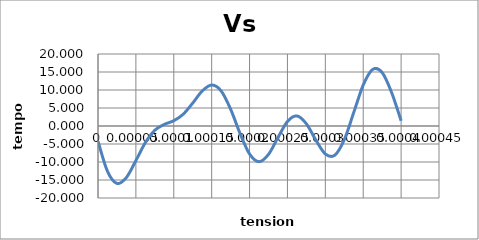
| Category | Vs |
|---|---|
| 0.0 | -4.243 |
| 1.25e-05 | -12.579 |
| 2.5e-05 | -15.953 |
| 3.7500000000000003e-05 | -14.296 |
| 5e-05 | -9.611 |
| 6.25e-05 | -4.611 |
| 7.500000000000001e-05 | -1.183 |
| 8.75e-05 | 0.453 |
| 0.0001 | 1.464 |
| 0.00011250000000000001 | 3.278 |
| 0.000125 | 6.364 |
| 0.0001375 | 9.716 |
| 0.00015000000000000001 | 11.389 |
| 0.00016250000000000002 | 9.752 |
| 0.000175 | 4.68 |
| 0.0001875 | -2.099 |
| 0.0002 | -7.769 |
| 0.00021250000000000002 | -9.915 |
| 0.00022500000000000002 | -7.883 |
| 0.0002375 | -3.199 |
| 0.00025 | 1.243 |
| 0.00026250000000000004 | 2.801 |
| 0.000275 | 0.603 |
| 0.0002875 | -3.915 |
| 0.00030000000000000003 | -7.769 |
| 0.0003125 | -8.099 |
| 0.00032500000000000004 | -3.805 |
| 0.0003375 | 3.752 |
| 0.00035 | 11.389 |
| 0.00036250000000000003 | 15.716 |
| 0.000375 | 14.849 |
| 0.00038750000000000004 | 9.278 |
| 0.0004 | 1.464 |